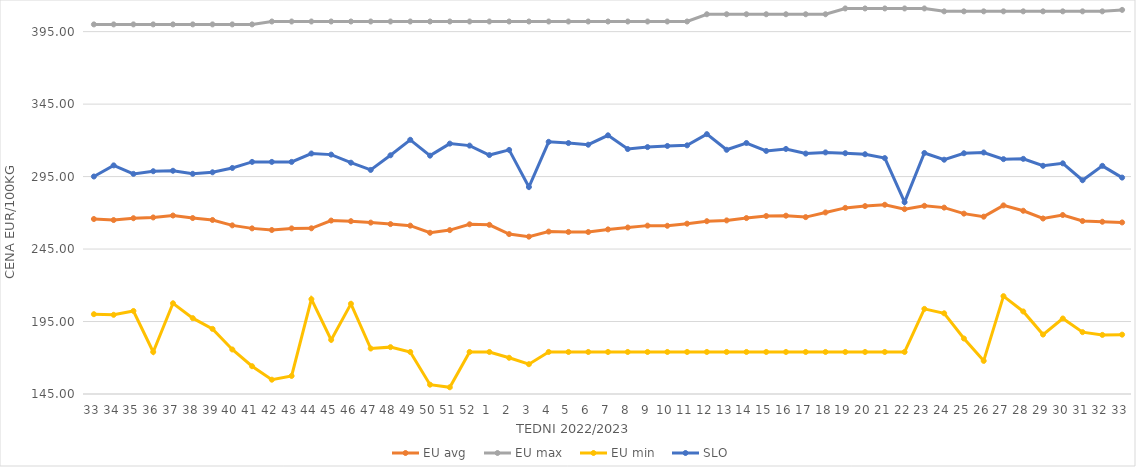
| Category | EU avg | EU max | EU min | SLO |
|---|---|---|---|---|
| 33.0 | 265.729 | 400 | 200.07 | 295.05 |
| 34.0 | 265.016 | 400 | 199.637 | 302.73 |
| 35.0 | 266.273 | 400 | 202.277 | 296.86 |
| 36.0 | 266.807 | 400 | 174 | 298.7 |
| 37.0 | 268.136 | 400 | 207.594 | 299.02 |
| 38.0 | 266.39 | 400 | 197.352 | 296.91 |
| 39.0 | 265.059 | 400 | 189.926 | 297.96 |
| 40.0 | 261.35 | 400 | 175.723 | 300.95 |
| 41.0 | 259.271 | 400 | 164.165 | 305.13 |
| 42.0 | 258.146 | 402 | 154.869 | 305.13 |
| 43.0 | 259.256 | 402 | 157.459 | 305.13 |
| 44.0 | 259.32 | 402 | 210.415 | 310.93 |
| 45.0 | 264.649 | 402 | 182.35 | 310.16 |
| 46.0 | 264.228 | 402 | 207.247 | 304.58 |
| 47.0 | 263.24 | 402 | 176.378 | 299.59 |
| 48.0 | 262.225 | 402 | 177.332 | 309.69 |
| 49.0 | 261.152 | 402 | 174 | 320.38 |
| 50.0 | 256.24 | 402 | 151.434 | 309.44 |
| 51.0 | 258.071 | 402 | 149.638 | 317.74 |
| 52.0 | 262.088 | 402 | 174 | 316.36 |
| 1.0 | 261.716 | 402 | 174 | 309.84 |
| 2.0 | 255.331 | 402 | 169.983 | 313.4 |
| 3.0 | 253.546 | 402 | 165.574 | 287.81 |
| 4.0 | 257.051 | 402 | 174 | 318.98 |
| 5.0 | 256.808 | 402 | 174 | 318.13 |
| 6.0 | 256.75 | 402 | 174 | 316.99 |
| 7.0 | 258.565 | 402 | 174 | 323.47 |
| 8.0 | 259.872 | 402 | 174 | 314 |
| 9.0 | 261.164 | 402 | 174 | 315.35 |
| 10.0 | 261.06 | 402 | 174 | 316.13 |
| 11.0 | 262.513 | 402 | 174 | 316.55 |
| 12.0 | 264.228 | 407 | 174 | 324.27 |
| 13.0 | 264.768 | 407 | 174 | 313.49 |
| 14.0 | 266.385 | 407 | 174 | 318.17 |
| 15.0 | 267.797 | 407 | 174 | 312.7 |
| 16.0 | 268.021 | 407 | 174 | 314.07 |
| 17.0 | 267.041 | 407 | 174 | 310.87 |
| 18.0 | 270.255 | 407 | 174 | 311.69 |
| 19.0 | 273.406 | 411 | 174 | 311.13 |
| 20.0 | 274.631 | 411 | 174 | 310.42 |
| 21.0 | 275.561 | 411 | 174 | 307.76 |
| 22.0 | 272.542 | 411 | 174 | 277.34 |
| 23.0 | 274.85 | 411 | 203.728 | 311.28 |
| 24.0 | 273.59 | 409 | 200.686 | 306.64 |
| 25.0 | 269.439 | 409 | 183.275 | 311.1 |
| 26.0 | 267.345 | 409 | 167.858 | 311.62 |
| 27.0 | 275.123 | 409 | 212.506 | 307.04 |
| 28.0 | 271.42 | 409 | 201.945 | 307.23 |
| 29.0 | 266.08 | 409 | 186.018 | 302.45 |
| 30.0 | 268.489 | 409 | 197.093 | 304.14 |
| 31.0 | 264.333 | 409 | 187.684 | 292.49 |
| 32.0 | 263.843 | 409 | 185.774 | 302.41 |
| 33.0 | 263.37 | 410 | 185.951 | 294.3 |